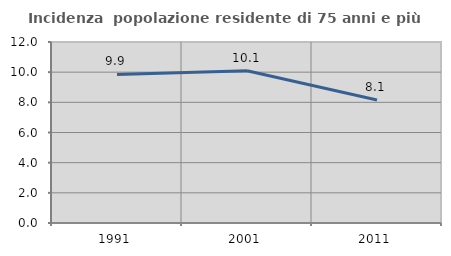
| Category | Incidenza  popolazione residente di 75 anni e più |
|---|---|
| 1991.0 | 9.85 |
| 2001.0 | 10.092 |
| 2011.0 | 8.149 |